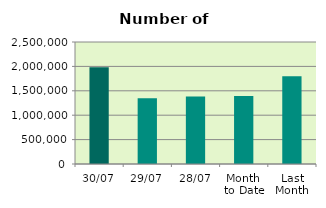
| Category | Series 0 |
|---|---|
| 30/07 | 1983212 |
| 29/07 | 1347430 |
| 28/07 | 1381878 |
| Month 
to Date | 1393263.364 |
| Last
Month | 1799892.818 |